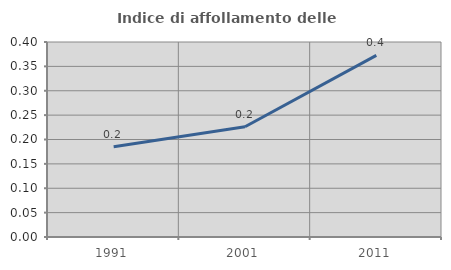
| Category | Indice di affollamento delle abitazioni  |
|---|---|
| 1991.0 | 0.185 |
| 2001.0 | 0.226 |
| 2011.0 | 0.373 |